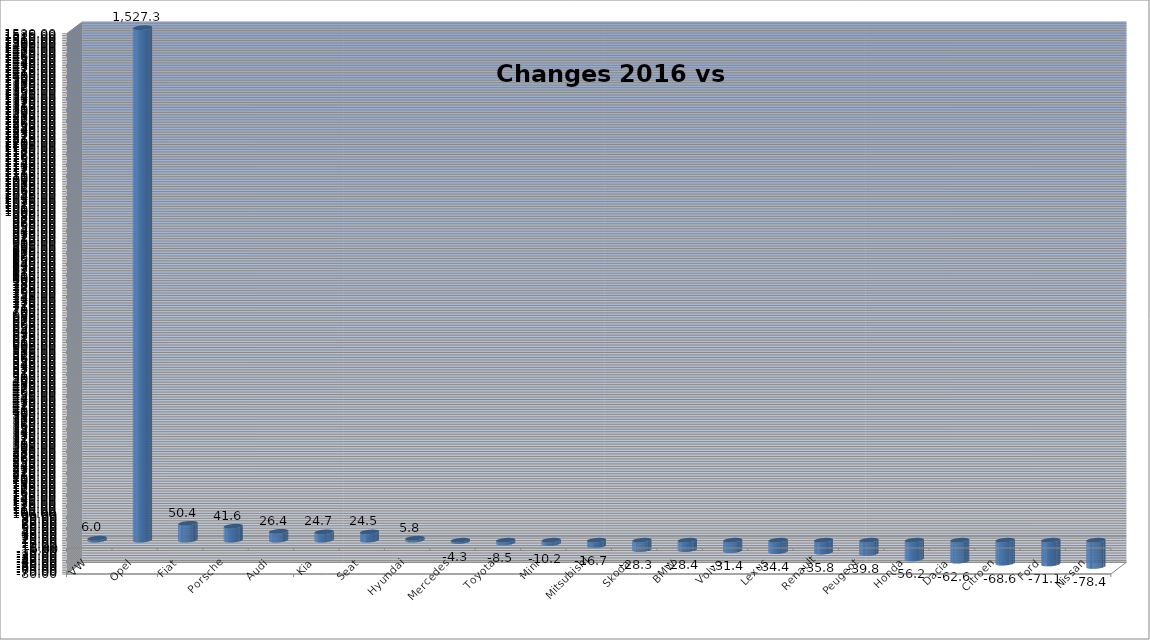
| Category | Ytd 2015 |
|---|---|
| VW | 6.02 |
| Opel | 1527.273 |
| Fiat | 50.37 |
| Porsche | 41.573 |
| Audi | 26.382 |
| Kia | 24.698 |
| Seat | 24.498 |
| Hyundai | 5.836 |
| Mercedes | -4.348 |
| Toyota | -8.479 |
| Mini | -10.152 |
| Mitsubishi | -16.698 |
| Skoda | -28.349 |
| BMW | -28.391 |
| Volvo | -31.426 |
| Lexus | -34.351 |
| Renault | -35.786 |
| Peugeot | -39.773 |
| Honda | -56.219 |
| Dacia | -62.637 |
| Citroen | -68.635 |
| Ford | -71.103 |
| Nissan | -78.45 |